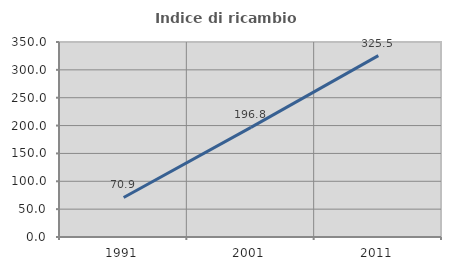
| Category | Indice di ricambio occupazionale  |
|---|---|
| 1991.0 | 70.922 |
| 2001.0 | 196.809 |
| 2011.0 | 325.49 |